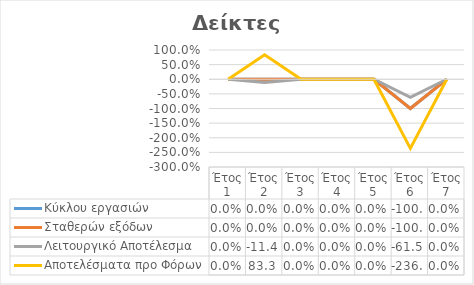
| Category | Κύκλου εργασιών | Σταθερών εξόδων | Λειτουργικό Αποτέλεσμα | Αποτελέσματα προ Φόρων |
|---|---|---|---|---|
| Έτος 1 | 0 | 0 | 0 | 0 |
| Έτος 2 | 0 | 0 | -0.114 | 0.833 |
| Έτος 3 | 0 | 0 | 0 | 0 |
| Έτος 4 | 0 | 0 | 0 | 0 |
| Έτος 5 | 0 | 0 | 0 | 0 |
| Έτος 6 | -1 | -1 | -0.615 | -2.364 |
| Έτος 7 | 0 | 0 | 0 | 0 |